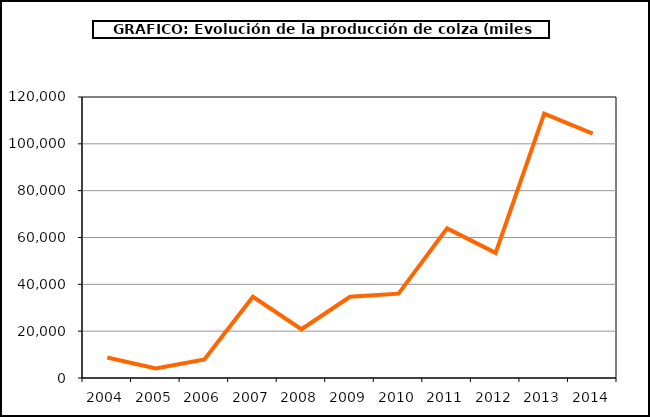
| Category | Producción |
|---|---|
| 2004.0 | 8760 |
| 2005.0 | 4113 |
| 2006.0 | 7926 |
| 2007.0 | 34700 |
| 2008.0 | 20816 |
| 2009.0 | 34663 |
| 2010.0 | 36029 |
| 2011.0 | 63902 |
| 2012.0 | 53447 |
| 2013.0 | 112928 |
| 2014.0 | 104361 |